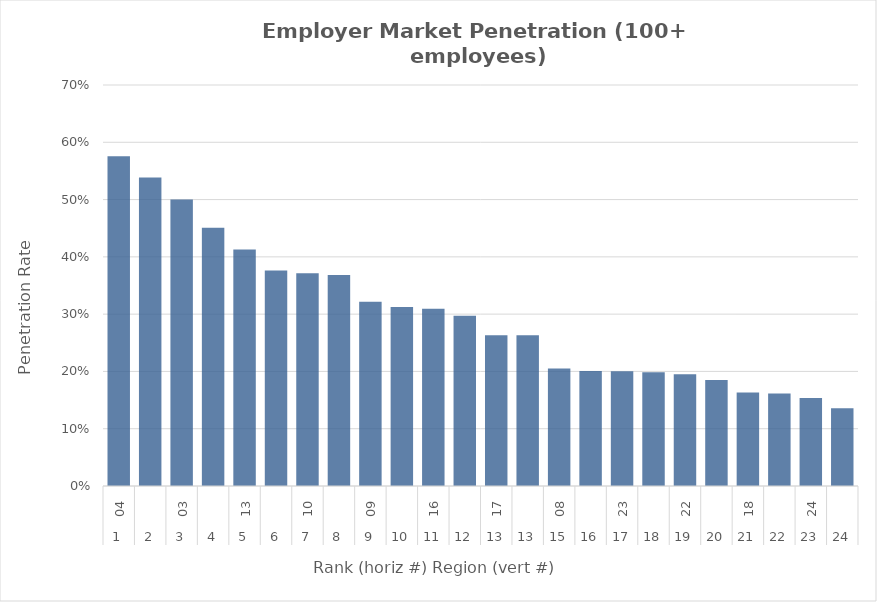
| Category | Rate |
|---|---|
| 0 | 0.575 |
| 1 | 0.538 |
| 2 | 0.5 |
| 3 | 0.451 |
| 4 | 0.413 |
| 5 | 0.376 |
| 6 | 0.372 |
| 7 | 0.368 |
| 8 | 0.322 |
| 9 | 0.312 |
| 10 | 0.309 |
| 11 | 0.297 |
| 12 | 0.263 |
| 13 | 0.263 |
| 14 | 0.205 |
| 15 | 0.201 |
| 16 | 0.2 |
| 17 | 0.198 |
| 18 | 0.195 |
| 19 | 0.185 |
| 20 | 0.163 |
| 21 | 0.161 |
| 22 | 0.154 |
| 23 | 0.136 |